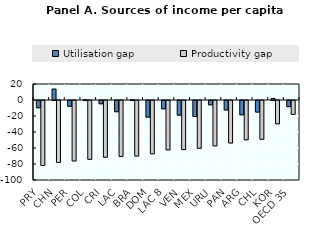
| Category | Utilisation gap | Productivity gap |
|---|---|---|
| PRY | -9.07 | -81.248 |
| CHN | 13.726 | -77.469 |
| PER | -7.247 | -75.59 |
| COL | 0.256 | -73.537 |
| CRI | -4.087 | -70.932 |
| LAC | -14.03 | -69.905 |
| BRA | 0.254 | -69.448 |
| DOM | -20.828 | -66.699 |
| LAC 8 | -10.345 | -61.766 |
| VEN | -18.284 | -61.383 |
| MEX | -20.013 | -59.748 |
| URU | -5.455 | -56.786 |
| PAN | -11.797 | -53.161 |
| ARG | -17.856 | -49.159 |
| CHL | -14.415 | -48.477 |
| KOR | 1.832 | -29.107 |
| OECD 35 | -7.692 | -17.301 |